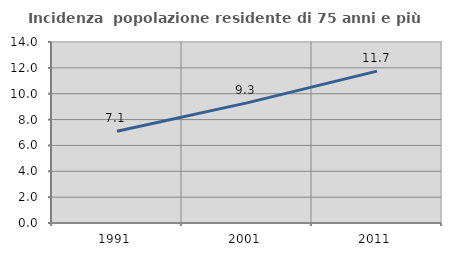
| Category | Incidenza  popolazione residente di 75 anni e più |
|---|---|
| 1991.0 | 7.097 |
| 2001.0 | 9.291 |
| 2011.0 | 11.749 |